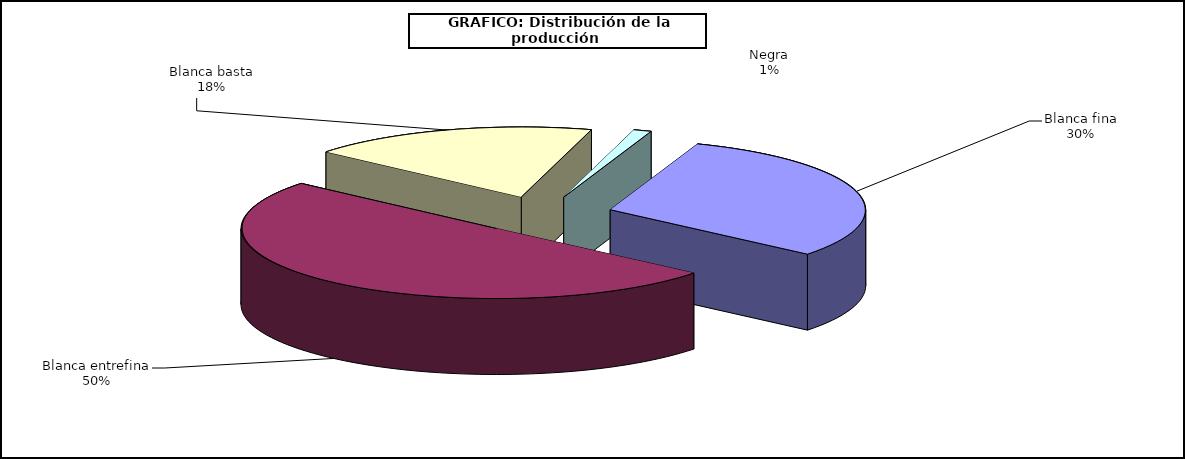
| Category | Series 0 |
|---|---|
| 0 | 6929.474 |
| 1 | 11439.19 |
| 2 | 4163.769 |
| 3 | 256.562 |